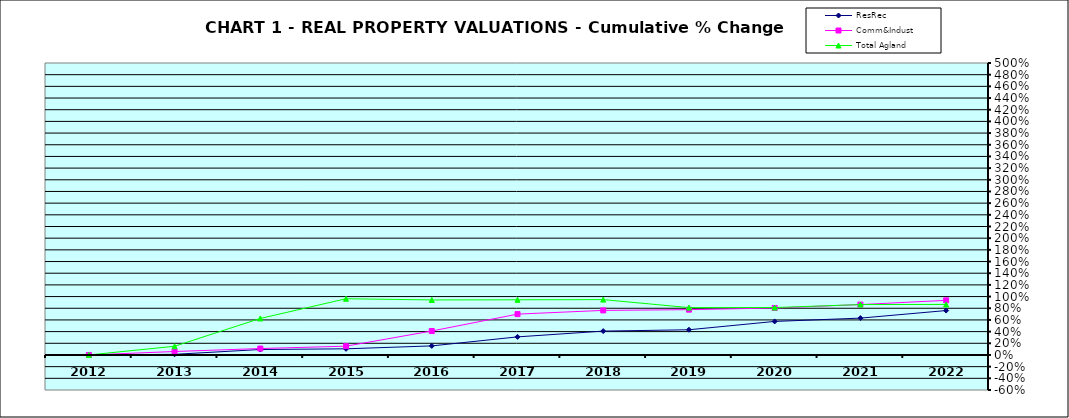
| Category | ResRec | Comm&Indust | Total Agland |
|---|---|---|---|
| 2012.0 | 0 | 0 | 0 |
| 2013.0 | 0.011 | 0.059 | 0.149 |
| 2014.0 | 0.094 | 0.11 | 0.626 |
| 2015.0 | 0.105 | 0.151 | 0.963 |
| 2016.0 | 0.155 | 0.41 | 0.942 |
| 2017.0 | 0.31 | 0.7 | 0.945 |
| 2018.0 | 0.409 | 0.763 | 0.948 |
| 2019.0 | 0.432 | 0.776 | 0.811 |
| 2020.0 | 0.574 | 0.805 | 0.812 |
| 2021.0 | 0.631 | 0.863 | 0.863 |
| 2022.0 | 0.761 | 0.935 | 0.866 |